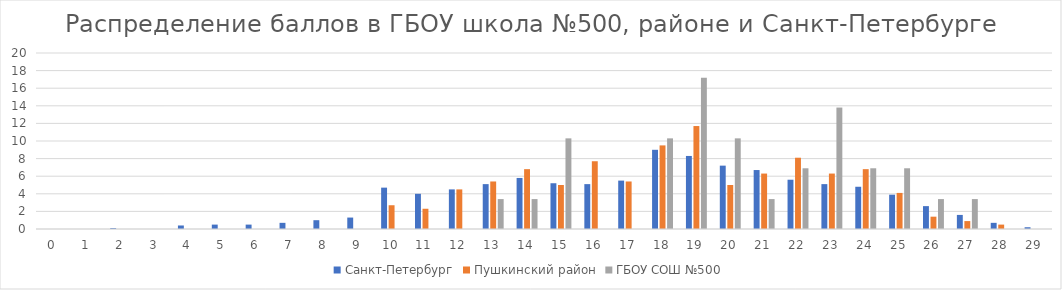
| Category | Санкт-Петербург | Пушкинский район | ГБОУ СОШ №500 |
|---|---|---|---|
| 0.0 | 0 | 0 | 0 |
| 1.0 | 0 | 0 | 0 |
| 2.0 | 0.1 | 0 | 0 |
| 3.0 | 0 | 0 | 0 |
| 4.0 | 0.4 | 0 | 0 |
| 5.0 | 0.5 | 0 | 0 |
| 6.0 | 0.5 | 0 | 0 |
| 7.0 | 0.7 | 0 | 0 |
| 8.0 | 1 | 0 | 0 |
| 9.0 | 1.3 | 0 | 0 |
| 10.0 | 4.7 | 2.7 | 0 |
| 11.0 | 4 | 2.3 | 0 |
| 12.0 | 4.5 | 4.5 | 0 |
| 13.0 | 5.1 | 5.4 | 3.4 |
| 14.0 | 5.8 | 6.8 | 3.4 |
| 15.0 | 5.2 | 5 | 10.3 |
| 16.0 | 5.1 | 7.7 | 0 |
| 17.0 | 5.5 | 5.4 | 0 |
| 18.0 | 9 | 9.5 | 10.3 |
| 19.0 | 8.3 | 11.7 | 17.2 |
| 20.0 | 7.2 | 5 | 10.3 |
| 21.0 | 6.7 | 6.3 | 3.4 |
| 22.0 | 5.6 | 8.1 | 6.9 |
| 23.0 | 5.1 | 6.3 | 13.8 |
| 24.0 | 4.8 | 6.8 | 6.9 |
| 25.0 | 3.9 | 4.1 | 6.9 |
| 26.0 | 2.6 | 1.4 | 3.4 |
| 27.0 | 1.6 | 0.9 | 3.4 |
| 28.0 | 0.7 | 0.5 | 0 |
| 29.0 | 0.2 | 0 | 0 |